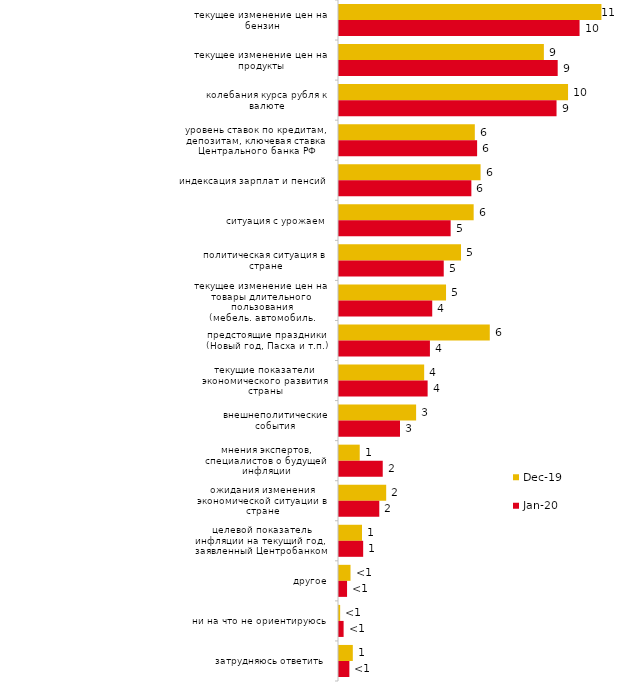
| Category | дек.19 | янв.20 |
|---|---|---|
| текущее изменение цен на бензин | 11.287 | 10.347 |
| текущее изменение цен на продукты | 8.812 | 9.406 |
| колебания курса рубля к валюте | 9.851 | 9.356 |
| уровень ставок по кредитам, депозитам, ключевая ставка Центрального банка РФ | 5.842 | 5.941 |
| индексация зарплат и пенсий | 6.089 | 5.693 |
| ситуация с урожаем | 5.792 | 4.802 |
| политическая ситуация в стране | 5.248 | 4.505 |
| текущее изменение цен на товары длительного пользования (мебель, автомобиль, бытовая техника и т.п.) | 4.604 | 4.01 |
| предстоящие праздники (Новый год, Пасха и т.п.) | 6.485 | 3.911 |
| текущие показатели экономического развития страны | 3.663 | 3.812 |
| внешнеполитические события | 3.317 | 2.624 |
| мнения экспертов, специалистов о будущей инфляции | 0.891 | 1.881 |
| ожидания изменения экономической ситуации в стране | 2.03 | 1.733 |
| целевой показатель инфляции на текущий год, заявленный Центробанком | 0.99 | 1.04 |
| другое | 0.495 | 0.347 |
| ни на что не ориентируюсь | 0.05 | 0.198 |
| затрудняюсь ответить | 0.594 | 0.446 |